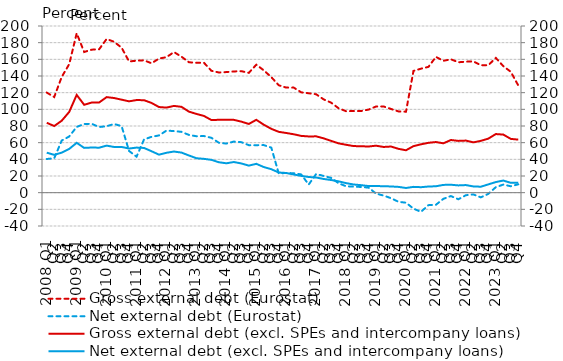
| Category | Gross external debt (Eurostat) | Net external debt (Eurostat) | Gross external debt (excl. SPEs and intercompany loans) |
|---|---|---|---|
|   2008 Q1 | 120.095 | 40.4 | 83.857 |
| Q2 | 114.77 | 41.3 | 79.961 |
| Q3 | 138.881 | 62.5 | 86.324 |
| Q4 | 154.146 | 67.4 | 96.87 |
|   2009 Q1 | 191.233 | 78.9 | 117.325 |
| Q2 | 168.777 | 82.4 | 105.436 |
| Q3 | 171.587 | 82.6 | 108.132 |
| Q4 | 172.092 | 78.8 | 108.199 |
|  2010 Q1 | 184.399 | 79.7 | 114.644 |
| Q2 | 181.075 | 82.4 | 113.577 |
| Q3 | 173.985 | 79.9 | 111.598 |
| Q4 | 157.463 | 50 | 109.6 |
|  2011 Q1 | 158.346 | 43.2 | 111.153 |
| Q2 | 158.832 | 63.9 | 110.959 |
| Q3 | 155.275 | 67 | 107.673 |
| Q4 | 160.912 | 68.7 | 102.749 |
|  2012 Q1 | 162.597 | 74.5 | 102.077 |
| Q2 | 168.703 | 73.9 | 104.115 |
| Q3 | 163.181 | 73 | 102.998 |
| Q4 | 156.48 | 69.3 | 97.225 |
|  2013 Q1 | 155.874 | 67.7 | 94.495 |
| Q2 | 155.938 | 68 | 92.085 |
| Q3 | 146.263 | 65.8 | 87.148 |
| Q4 | 144.207 | 59.9 | 87.426 |
|  2014 Q1 | 144.703 | 58.9 | 87.515 |
| Q2 | 145.466 | 61.3 | 87.366 |
| Q3 | 145.799 | 60.6 | 85.24 |
| Q4 | 143.774 | 57 | 82.439 |
|  2015 Q1 | 153.581 | 57 | 87.432 |
| Q2 | 146.764 | 57.1 | 81.526 |
| Q3 | 138.694 | 54.1 | 76.623 |
| Q4 | 128.896 | 23 | 72.998 |
|  2016 Q1 | 126.063 | 23.7 | 71.612 |
| Q2 | 126.094 | 23.3 | 70.086 |
| Q3 | 120.396 | 21.9 | 68.124 |
| Q4 | 119.283 | 9.77 | 67.465 |
|  2017 Q1 | 118.074 | 22.408 | 67.582 |
| Q2 | 111.944 | 20.075 | 65.179 |
| Q3 | 108.022 | 17.717 | 62.12 |
| Q4 | 101.242 | 11.237 | 59.162 |
|  2018 Q1 | 97.767 | 7.672 | 57.461 |
| Q2 | 97.927 | 7.223 | 55.916 |
| Q3 | 97.945 | 6.866 | 55.699 |
| Q4 | 99.677 | 6.037 | 55.385 |
|  2019 Q1 | 103.397 | -1.143 | 56.379 |
| Q2 | 103.458 | -3.435 | 54.85 |
| Q3 | 100.444 | -6.64 | 55.373 |
| Q4 | 97.467 | -10.934 | 52.586 |
|  2020 Q1 | 97.205 | -12.064 | 50.884 |
| Q2 | 146.106 | -19.149 | 55.819 |
| Q3 | 148.766 | -23.005 | 58.014 |
| Q4 | 150.932 | -14.977 | 59.845 |
|  2021 Q1 | 162.953 | -14.498 | 60.755 |
| Q2 | 158.244 | -7.393 | 59.245 |
| Q3 | 160.055 | -4.068 | 63.176 |
| Q4 | 156.46 | -7.93 | 62.126 |
|  2022 Q1 | 157.194 | -3.055 | 62.497 |
| Q2 | 157.572 | -2.129 | 60.372 |
| Q3 | 152.934 | -5.643 | 62.172 |
| Q4 | 152.94 | -1.432 | 64.845 |
|  2023 Q1 | 161.719 | 6.599 | 70.336 |
| Q2 | 151.841 | 9.699 | 69.704 |
| Q3 | 145.052 | 7.704 | 64.554 |
| Q4 | 128.712 | 9.977 | 63.645 |